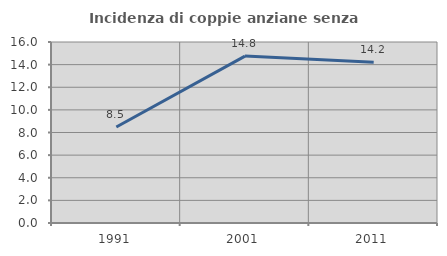
| Category | Incidenza di coppie anziane senza figli  |
|---|---|
| 1991.0 | 8.483 |
| 2001.0 | 14.752 |
| 2011.0 | 14.218 |